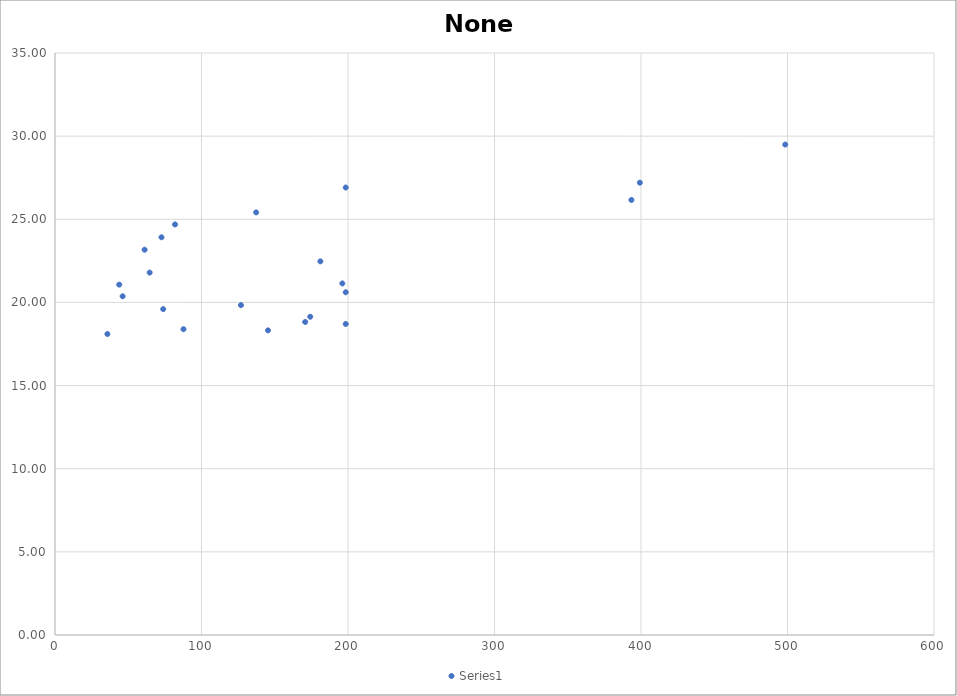
| Category | Series 0 |
|---|---|
| 35.7692307692273 | 18.101 |
| 145.384615384612 | 18.319 |
| 87.6923076923044 | 18.391 |
| 198.461538461535 | 18.705 |
| 170.769230769227 | 18.825 |
| 174.230769230766 | 19.139 |
| 73.8461538461508 | 19.598 |
| 126.923076923073 | 19.839 |
| 46.153846153843 | 20.37 |
| 198.461538461535 | 20.611 |
| 43.8461538461508 | 21.07 |
| 196.153846153843 | 21.142 |
| 64.6153846153818 | 21.794 |
| 181.153846153843 | 22.47 |
| 61.1538461538436 | 23.17 |
| 72.6923076923053 | 23.918 |
| 81.923076923075 | 24.69 |
| 137.30769230769 | 25.414 |
| 393.461538461536 | 26.163 |
| 198.461538461536 | 26.911 |
| 399.230769230767 | 27.2 |
| 498.461538461537 | 29.493 |